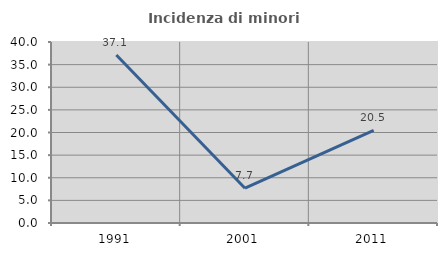
| Category | Incidenza di minori stranieri |
|---|---|
| 1991.0 | 37.143 |
| 2001.0 | 7.692 |
| 2011.0 | 20.455 |